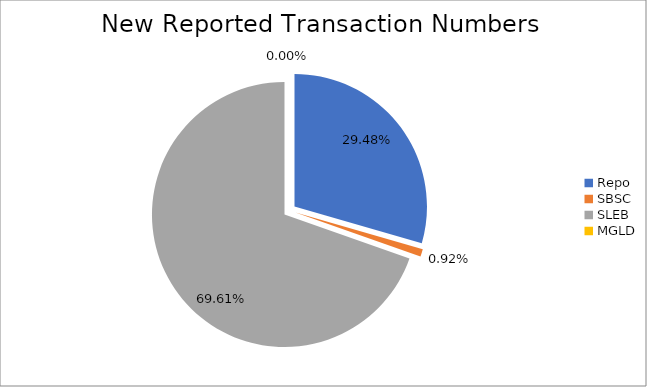
| Category | Series 0 |
|---|---|
| Repo | 292498 |
| SBSC | 9082 |
| SLEB | 690674 |
| MGLD | 15 |